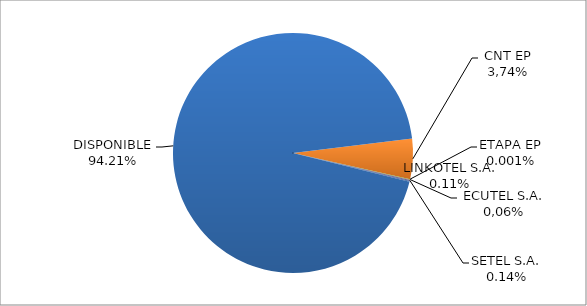
| Category | CODIGO DE AREA 6 |
|---|---|
| CORPORACIÓN NACIONAL TELECOMUNICACIONES CNT EP | 0.054 |
| ETAPA EP | 0 |
| CONECEL (ex ECUADORTELECOM S.A.) | 0.001 |
| SETEL S.A. | 0.001 |
| LINKOTEL S.A. | 0.001 |
| DISPONIBLE | 0.942 |